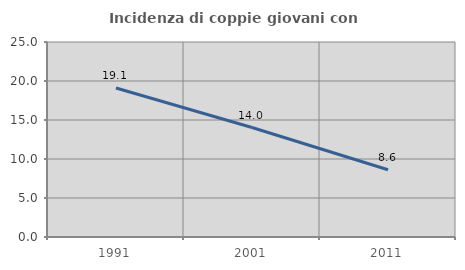
| Category | Incidenza di coppie giovani con figli |
|---|---|
| 1991.0 | 19.108 |
| 2001.0 | 14.035 |
| 2011.0 | 8.625 |